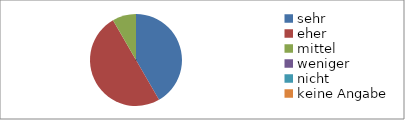
| Category | Series 0 |
|---|---|
| sehr | 10 |
| eher | 12 |
| mittel | 2 |
| weniger | 0 |
| nicht | 0 |
| keine Angabe | 0 |